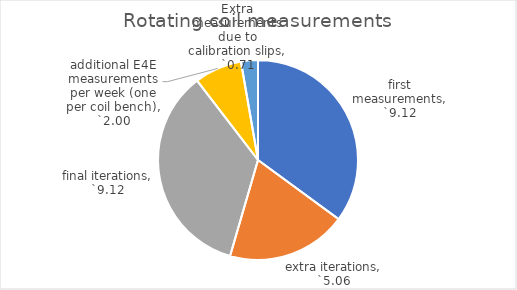
| Category | Rotating coil measurements |
|---|---|
| first measurements | 9.12 |
| extra iterations | 5.057 |
| final iterations | 9.12 |
| additional E4E measurements per week (one per coil bench) | 2 |
| Extra measurements due to calibration slips | 0.712 |